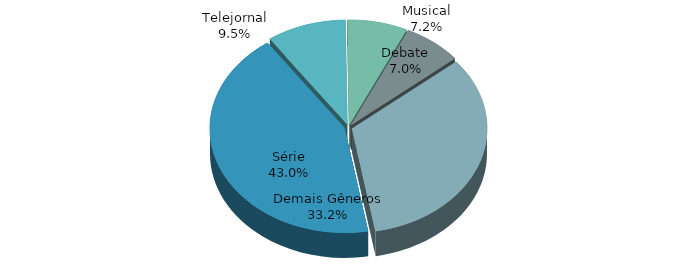
| Category | Series 0 |
|---|---|
| Série | 0.43 |
| Telejornal | 0.095 |
| Musical | 0.072 |
| Debate | 0.07 |
| Demais Gêneros | 0.332 |